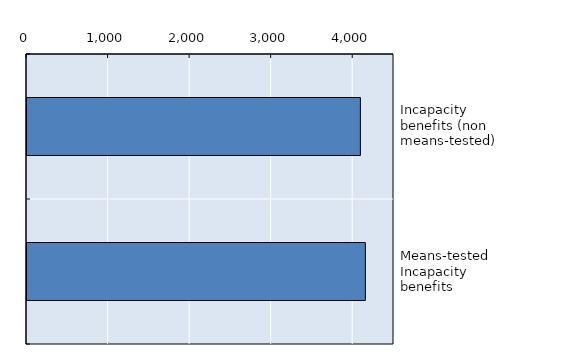
| Category | Series 0 |
|---|---|
| Incapacity benefits (non means-tested) | 4088 |
| Means-tested Incapacity benefits | 4149 |